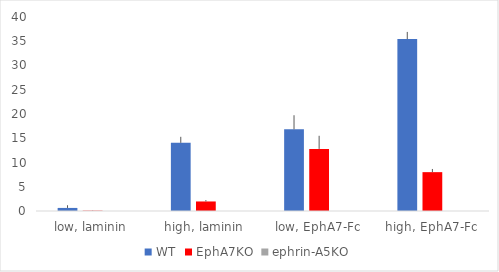
| Category | WT | EphA7KO | ephrin-A5KO |
|---|---|---|---|
| low, laminin | 0.633 | 0.067 | 0 |
| high, laminin | 14.047 | 1.965 | 0 |
| low, EphA7-Fc | 16.844 | 12.8 | 0 |
| high, EphA7-Fc | 35.45 | 8.01 | 0 |